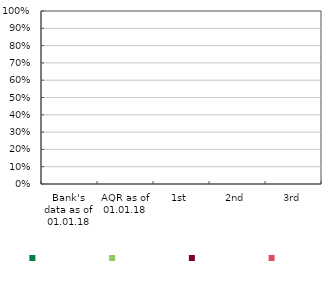
| Category | Series 0 | Series 1 | Series 2 | Series 3 |
|---|---|---|---|---|
| Bank's data as of 01.01.18 | 0 | 0 | 0 | 0 |
| AQR as of 01.01.18 | 0 | 0 | 0 | 0 |
| 1st | 0 | 0 | 0 | 0 |
| 2nd | 0 | 0 | 0 | 0 |
| 3rd | 0 | 0 | 0 | 0 |